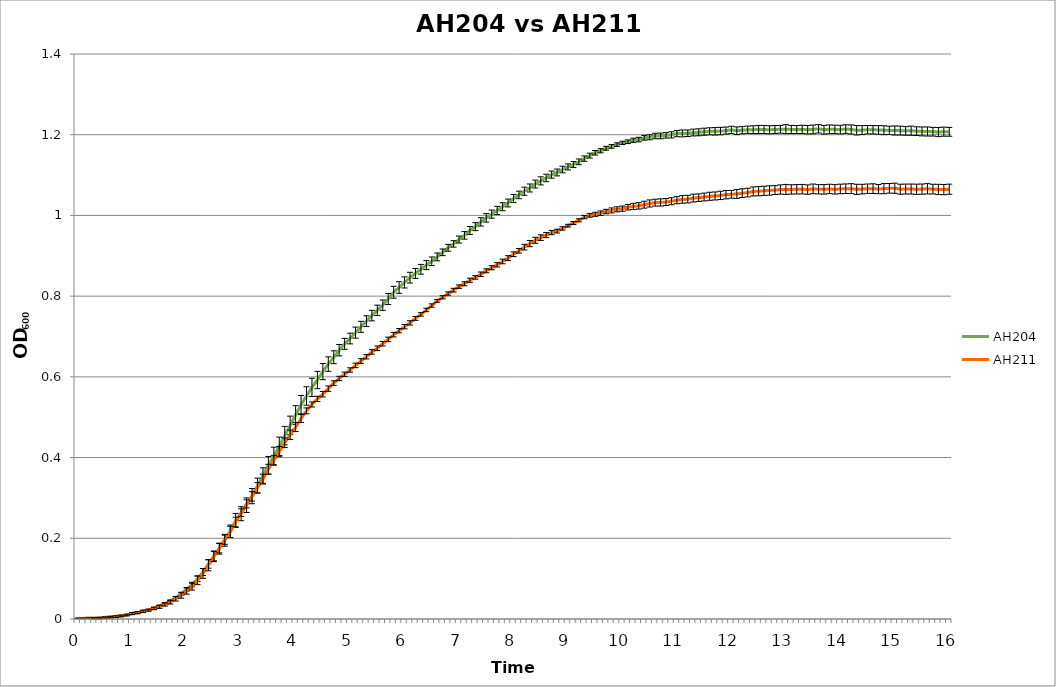
| Category | AH204 | AH211 |
|---|---|---|
| 0.0 | 0.001 | 0 |
| nan | 0.002 | 0.001 |
| nan | 0.003 | 0.001 |
| nan | 0.002 | 0.002 |
| nan | 0.003 | 0.002 |
| nan | 0.004 | 0.004 |
| nan | 0.005 | 0.005 |
| nan | 0.007 | 0.006 |
| nan | 0.008 | 0.008 |
| nan | 0.01 | 0.01 |
| 1.0 | 0.014 | 0.013 |
| nan | 0.016 | 0.016 |
| nan | 0.02 | 0.019 |
| nan | 0.023 | 0.022 |
| nan | 0.027 | 0.026 |
| nan | 0.033 | 0.03 |
| nan | 0.039 | 0.036 |
| nan | 0.045 | 0.042 |
| nan | 0.053 | 0.05 |
| nan | 0.062 | 0.058 |
| 2.0 | 0.073 | 0.069 |
| nan | 0.085 | 0.08 |
| nan | 0.1 | 0.096 |
| nan | 0.116 | 0.113 |
| nan | 0.136 | 0.133 |
| nan | 0.156 | 0.155 |
| nan | 0.174 | 0.175 |
| nan | 0.194 | 0.197 |
| nan | 0.217 | 0.216 |
| nan | 0.244 | 0.24 |
| 3.0 | 0.261 | 0.264 |
| nan | 0.282 | 0.285 |
| nan | 0.304 | 0.304 |
| nan | 0.33 | 0.325 |
| nan | 0.355 | 0.347 |
| nan | 0.381 | 0.371 |
| nan | 0.404 | 0.393 |
| nan | 0.428 | 0.415 |
| nan | 0.454 | 0.437 |
| nan | 0.48 | 0.457 |
| 4.0 | 0.505 | 0.476 |
| nan | 0.531 | 0.497 |
| nan | 0.553 | 0.516 |
| nan | 0.574 | 0.532 |
| nan | 0.592 | 0.545 |
| nan | 0.613 | 0.557 |
| nan | 0.632 | 0.571 |
| nan | 0.649 | 0.585 |
| nan | 0.666 | 0.596 |
| nan | 0.682 | 0.606 |
| 5.0 | 0.695 | 0.617 |
| nan | 0.71 | 0.628 |
| nan | 0.724 | 0.639 |
| nan | 0.738 | 0.65 |
| nan | 0.752 | 0.662 |
| nan | 0.765 | 0.671 |
| nan | 0.778 | 0.682 |
| nan | 0.793 | 0.693 |
| nan | 0.81 | 0.705 |
| nan | 0.821 | 0.714 |
| 6.0 | 0.834 | 0.724 |
| nan | 0.846 | 0.734 |
| nan | 0.856 | 0.745 |
| nan | 0.867 | 0.755 |
| nan | 0.877 | 0.766 |
| nan | 0.886 | 0.777 |
| nan | 0.897 | 0.788 |
| nan | 0.909 | 0.797 |
| nan | 0.92 | 0.806 |
| nan | 0.929 | 0.815 |
| 7.0 | 0.94 | 0.824 |
| nan | 0.951 | 0.831 |
| nan | 0.963 | 0.839 |
| nan | 0.972 | 0.846 |
| nan | 0.984 | 0.854 |
| nan | 0.994 | 0.863 |
| nan | 1.003 | 0.87 |
| nan | 1.012 | 0.878 |
| nan | 1.022 | 0.886 |
| nan | 1.031 | 0.894 |
| 8.0 | 1.042 | 0.904 |
| nan | 1.051 | 0.912 |
| nan | 1.06 | 0.921 |
| nan | 1.068 | 0.93 |
| nan | 1.078 | 0.938 |
| nan | 1.086 | 0.945 |
| nan | 1.093 | 0.951 |
| nan | 1.101 | 0.958 |
| nan | 1.106 | 0.961 |
| nan | 1.114 | 0.968 |
| 9.0 | 1.12 | 0.975 |
| nan | 1.126 | 0.981 |
| nan | 1.133 | 0.988 |
| nan | 1.141 | 0.996 |
| nan | 1.148 | 1 |
| nan | 1.155 | 1.003 |
| nan | 1.16 | 1.006 |
| nan | 1.166 | 1.01 |
| nan | 1.171 | 1.012 |
| nan | 1.175 | 1.015 |
| 10.0 | 1.18 | 1.017 |
| nan | 1.183 | 1.02 |
| nan | 1.186 | 1.022 |
| nan | 1.188 | 1.024 |
| nan | 1.192 | 1.027 |
| nan | 1.194 | 1.03 |
| nan | 1.197 | 1.032 |
| nan | 1.197 | 1.032 |
| nan | 1.198 | 1.033 |
| nan | 1.2 | 1.035 |
| 11.0 | 1.203 | 1.038 |
| nan | 1.203 | 1.04 |
| nan | 1.204 | 1.04 |
| nan | 1.205 | 1.043 |
| nan | 1.206 | 1.044 |
| nan | 1.207 | 1.046 |
| nan | 1.208 | 1.047 |
| nan | 1.208 | 1.048 |
| nan | 1.209 | 1.05 |
| nan | 1.21 | 1.051 |
| 12.0 | 1.212 | 1.052 |
| nan | 1.21 | 1.053 |
| nan | 1.211 | 1.055 |
| nan | 1.212 | 1.057 |
| nan | 1.212 | 1.059 |
| nan | 1.213 | 1.06 |
| nan | 1.213 | 1.061 |
| nan | 1.212 | 1.062 |
| nan | 1.213 | 1.063 |
| nan | 1.213 | 1.064 |
| 13.0 | 1.214 | 1.064 |
| nan | 1.213 | 1.064 |
| nan | 1.213 | 1.065 |
| nan | 1.213 | 1.065 |
| nan | 1.212 | 1.064 |
| nan | 1.213 | 1.066 |
| nan | 1.215 | 1.065 |
| nan | 1.212 | 1.065 |
| nan | 1.213 | 1.066 |
| nan | 1.213 | 1.065 |
| 14.0 | 1.213 | 1.066 |
| nan | 1.214 | 1.066 |
| nan | 1.213 | 1.066 |
| nan | 1.211 | 1.065 |
| nan | 1.211 | 1.065 |
| nan | 1.212 | 1.066 |
| nan | 1.212 | 1.066 |
| nan | 1.212 | 1.065 |
| nan | 1.211 | 1.066 |
| nan | 1.211 | 1.067 |
| 15.0 | 1.21 | 1.067 |
| nan | 1.21 | 1.065 |
| nan | 1.209 | 1.065 |
| nan | 1.21 | 1.065 |
| nan | 1.209 | 1.065 |
| nan | 1.208 | 1.065 |
| nan | 1.208 | 1.066 |
| nan | 1.207 | 1.065 |
| nan | 1.207 | 1.064 |
| nan | 1.208 | 1.064 |
| 16.0 | 1.207 | 1.065 |